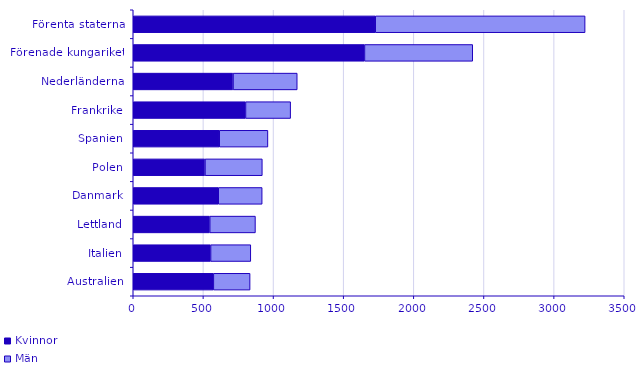
| Category | Kvinnor | Män |
|---|---|---|
| Australien | 571 | 262 |
| Italien | 551 | 287 |
| Lettland | 545 | 326 |
| Danmark | 606 | 313 |
| Polen | 511 | 409 |
| Spanien | 613 | 347 |
| Frankrike | 800 | 322 |
| Nederländerna | 711 | 458 |
| Förenade kungariket | 1648 | 772 |
| Förenta staterna | 1725 | 1496 |